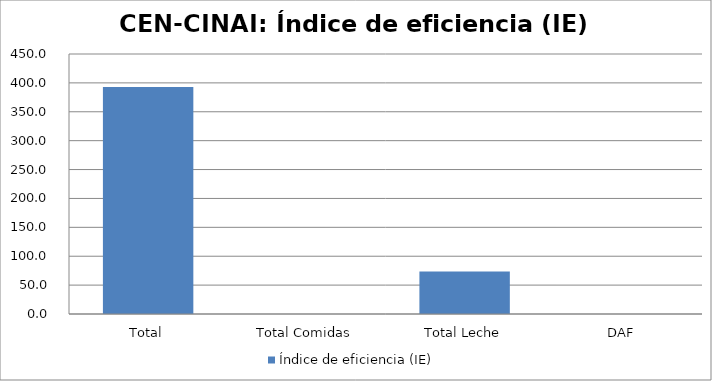
| Category | Índice de eficiencia (IE)  |
|---|---|
| Total | 392.959 |
| Total Comidas | 0 |
| Total Leche | 73.59 |
| DAF | 0 |